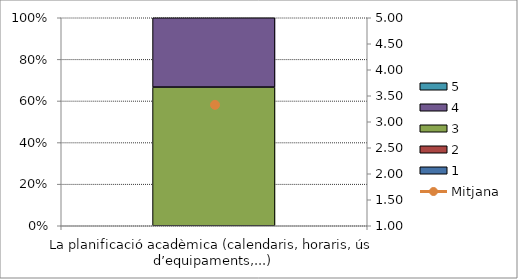
| Category | 1 | 2 | 3 | 4 | 5 |
|---|---|---|---|---|---|
| La planificació acadèmica (calendaris, horaris, ús d’equipaments,...) | 0 | 0 | 2 | 1 | 0 |